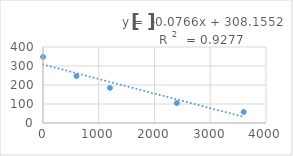
| Category | Series 0 |
|---|---|
| 0.0 | 348 |
| 600.0 | 247 |
| 1200.0 | 185 |
| 2400.0 | 105 |
| 3600.0 | 58 |